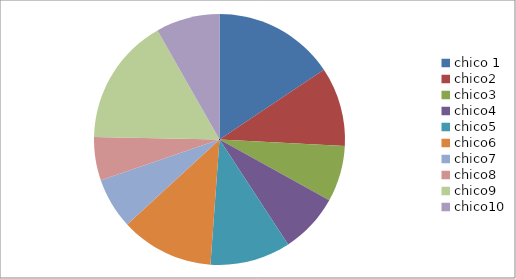
| Category | Series 0 |
|---|---|
| chico 1 | 95 |
| chico2 | 62 |
| chico3 | 44 |
| chico4 | 47 |
| chico5 | 63 |
| chico6 | 73 |
| chico7 | 40 |
| chico8 | 34 |
| chico9 | 100 |
| chico10 | 50 |